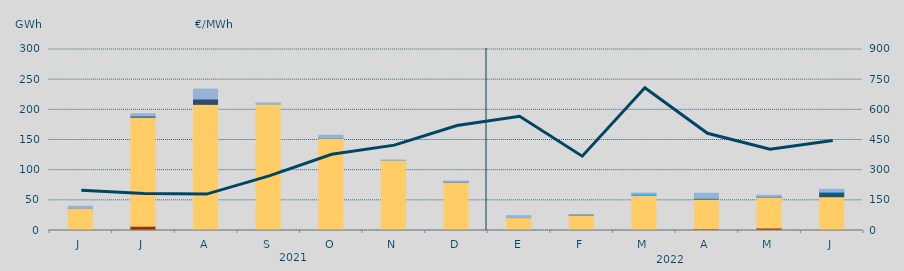
| Category | Carbón | Ciclo Combinado | Cogeneración | Consumo Bombeo | Enlace Península Baleares | Eólica | Hidráulica | Internacionales | Otras Renovables | Residuos no Renovables | Solar fotovoltaica | Solar térmica | Turbinación bombeo |
|---|---|---|---|---|---|---|---|---|---|---|---|---|---|
| J | 1670 | 34622.5 | 0 | 0 | 136.7 | 0 | 121.8 | 0 | 0 | 0 | 0 | 0 | 3610.8 |
| J | 7219 | 180584.6 | 0 | 1924.9 | 0 | 0 | 0 | 0 | 0 | 0 | 0 | 0 | 3801.6 |
| A | 0 | 209052.1 | 0 | 8918.2 | 0 | 0 | 0 | 0 | 0 | 0 | 0 | 0 | 16379.8 |
| S | 1190 | 208735.2 | 0 | 0 | 0 | 0 | 34.4 | 0 | 0 | 0 | 0 | 0 | 1592.2 |
| O | 1340 | 151473.6 | 0 | 156.2 | 0 | 0 | 130 | 0 | 0 | 0 | 0 | 0 | 4869.5 |
| N | 165 | 115928.8 | 0 | 16.1 | 30.6 | 0 | 0 | 0 | 0 | 0 | 0 | 0 | 373.4 |
| D | 0 | 79972.3 | 0 | 260.2 | 0 | 0 | 196.2 | 0 | 0 | 0 | 0 | 0 | 1577.4 |
| E | 0 | 21421.9 | 0 | 131 | 0 | 0 | 11.7 | 0 | 0 | 0 | 0 | 0 | 3055.8 |
| F | 0 | 25414.5 | 0 | 90.9 | 0 | 0 | 0 | 0 | 0 | 0 | 0 | 0 | 102.5 |
| M | 0 | 58378.9 | 0 | 0 | 204 | 0 | 2030 | 0 | 0 | 0 | 0 | 0 | 1537.1 |
| A | 2650 | 49297.5 | 0 | 1035.9 | 250 | 0 | 506.1 | 0 | 0 | 0 | 0 | 0 | 8012.5 |
| M | 4151 | 51455.8 | 0 | 906.775 | 0 | 0 | 22.4 | 0 | 0 | 0 | 0 | 0 | 1817.044 |
| J | 865 | 55112.458 | 0 | 7229.298 | 0 | 0.5 | 1411.333 | 0 | 0 | 0 | 0 | 0 | 3733.801 |